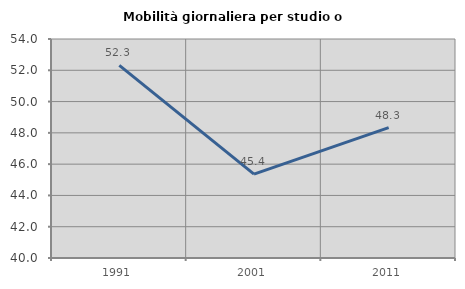
| Category | Mobilità giornaliera per studio o lavoro |
|---|---|
| 1991.0 | 52.318 |
| 2001.0 | 45.358 |
| 2011.0 | 48.336 |